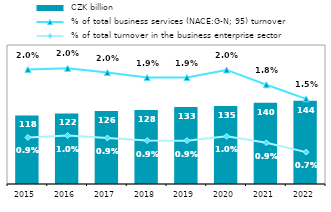
| Category |  CZK billion |
|---|---|
| 2015.0 | 118.336 |
| 2016.0 | 121.884 |
| 2017.0 | 125.872 |
| 2018.0 | 127.568 |
| 2019.0 | 132.752 |
| 2020.0 | 134.726 |
| 2021.0 | 140.288 |
| 2022.0 | 143.838 |